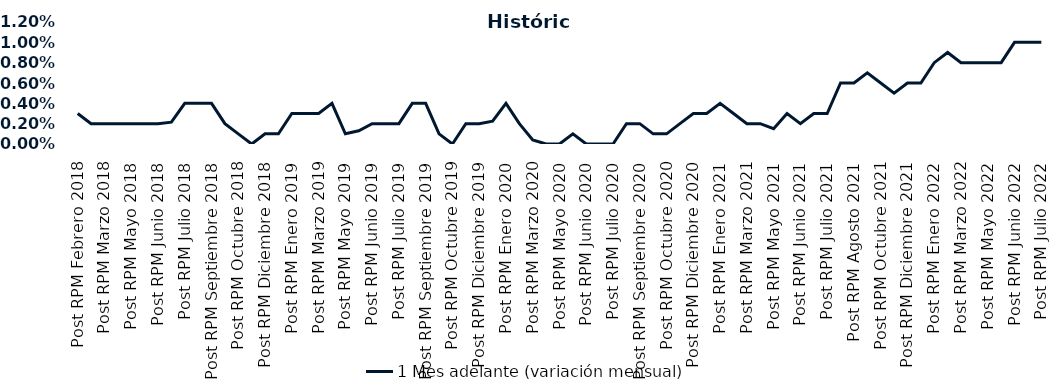
| Category | 1 Mes adelante (variación mensual) |
|---|---|
| Post RPM Febrero 2018 | 0.003 |
| Pre RPM Marzo 2018 | 0.002 |
| Post RPM Marzo 2018 | 0.002 |
| Pre RPM Mayo 2018 | 0.002 |
| Post RPM Mayo 2018 | 0.002 |
| Pre RPM Junio 2018 | 0.002 |
| Post RPM Junio 2018 | 0.002 |
| Pre RPM Julio 2018 | 0.002 |
| Post RPM Julio 2018 | 0.004 |
| Pre RPM Septiembre 2018 | 0.004 |
| Post RPM Septiembre 2018 | 0.004 |
| Pre RPM Octubre 2018 | 0.002 |
| Post RPM Octubre 2018 | 0.001 |
| Pre RPM Diciembre 2018 | 0 |
| Post RPM Diciembre 2018 | 0.001 |
| Pre RPM Enero 2019 | 0.001 |
| Post RPM Enero 2019 | 0.003 |
| Pre RPM Marzo 2019 | 0.003 |
| Post RPM Marzo 2019 | 0.003 |
| Pre RPM Mayo 2019 | 0.004 |
| Post RPM Mayo 2019 | 0.001 |
| Pre RPM Junio 2019 | 0.001 |
| Post RPM Junio 2019 | 0.002 |
| Pre RPM Julio 2019 | 0.002 |
| Post RPM Julio 2019 | 0.002 |
| Pre RPM Septiembre 2019 | 0.004 |
| Post RPM Septiembre 2019 | 0.004 |
| Pre RPM Octubre 2019 | 0.001 |
| Post RPM Octubre 2019 | 0 |
| Pre RPM Diciembre 2019 | 0.002 |
| Post RPM Diciembre 2019 | 0.002 |
| Pre RPM Enero 2020 | 0.002 |
| Post RPM Enero 2020 | 0.004 |
| Pre RPM Marzo 2020 | 0.002 |
| Post RPM Marzo 2020 | 0 |
| Pre RPM Mayo 2020 | 0 |
| Post RPM Mayo 2020 | 0 |
| Pre RPM Junio 2020 | 0.001 |
| Post RPM Junio 2020 | 0 |
| Pre RPM Julio 2020 | 0 |
| Post RPM Julio 2020 | 0 |
| Pre RPM Septiembre 2020 | 0.002 |
| Post RPM Septiembre 2020 | 0.002 |
| Pre RPM Octubre 2020 | 0.001 |
| Post RPM Octubre 2020 | 0.001 |
| Pre RPM Diciembre 2020 | 0.002 |
| Post RPM Diciembre 2020 | 0.003 |
| Pre RPM Enero 2021 | 0.003 |
| Post RPM Enero 2021 | 0.004 |
| Pre RPM Marzo 2021 | 0.003 |
| Post RPM Marzo 2021 | 0.002 |
| Pre RPM Mayo 2021 | 0.002 |
| Post RPM Mayo 2021 | 0.002 |
| Pre RPM Junio 2021 | 0.003 |
| Post RPM Junio 2021 | 0.002 |
| Pre RPM Julio 2021 | 0.003 |
| Post RPM Julio 2021 | 0.003 |
| Pre RPM Agosto 2021 | 0.006 |
| Post RPM Agosto 2021 | 0.006 |
| Pre RPM Octubre 2021 | 0.007 |
| Post RPM Octubre 2021 | 0.006 |
| Pre RPM Diciembre 2021 | 0.005 |
| Post RPM Diciembre 2021 | 0.006 |
| Pre RPM Enero 2022 | 0.006 |
| Post RPM Enero 2022 | 0.008 |
| Pre RPM Marzo 2022 | 0.009 |
| Post RPM Marzo 2022 | 0.008 |
| Pre RPM Mayo 2022 | 0.008 |
| Post RPM Mayo 2022 | 0.008 |
| Pre RPM Junio 2022 | 0.008 |
| Post RPM Junio 2022 | 0.01 |
| Pre RPM Julio 2022 | 0.01 |
| Post RPM Julio 2022 | 0.01 |